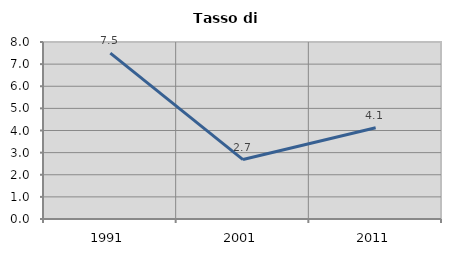
| Category | Tasso di disoccupazione   |
|---|---|
| 1991.0 | 7.495 |
| 2001.0 | 2.686 |
| 2011.0 | 4.122 |